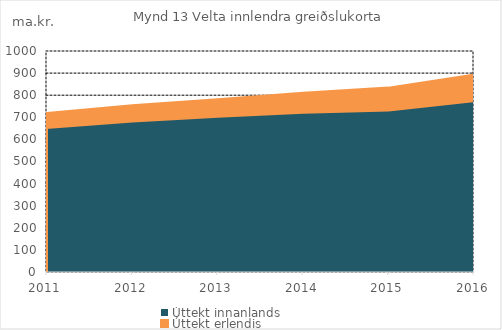
| Category | Úttekt innanlands | Úttekt erlendis |
|---|---|---|
| 2011.0 | 652.459 | 67.108 |
| 2012.0 | 681.039 | 73.535 |
| 2013.0 | 702.331 | 79.124 |
| 2014.0 | 721.138 | 89.582 |
| 2015.0 | 730.776 | 103.529 |
| 2016.0 | 773.001 | 120.194 |